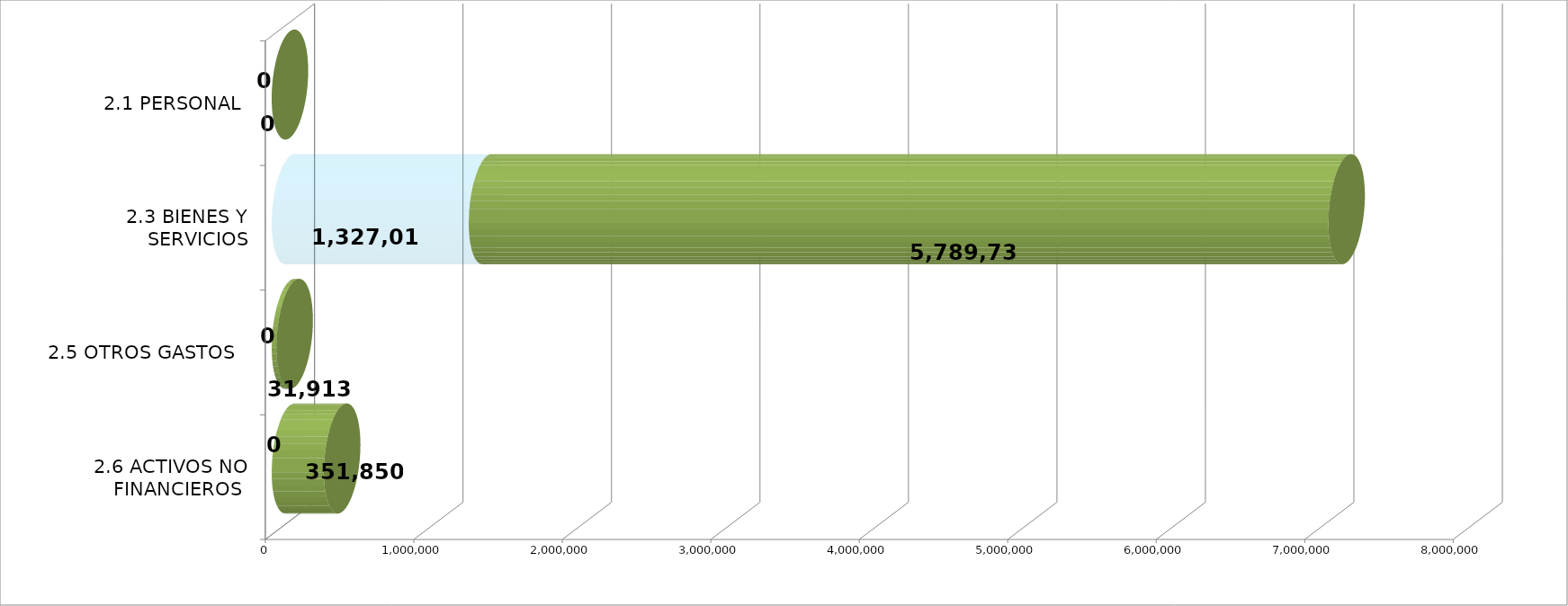
| Category | EJECUTADO | SALDO  |
|---|---|---|
| 2.1 PERSONAL | 0 | 0 |
| 2.3 BIENES Y SERVICIOS | 1327009.64 | 5789735.36 |
| 2.5 OTROS GASTOS  | 0 | 31913 |
| 2.6 ACTIVOS NO FINANCIEROS  | 0 | 351850 |